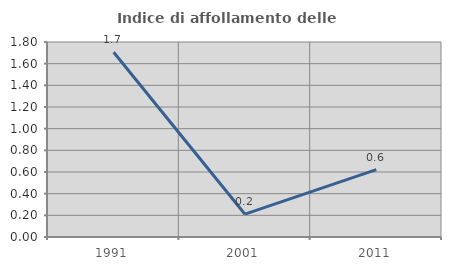
| Category | Indice di affollamento delle abitazioni  |
|---|---|
| 1991.0 | 1.706 |
| 2001.0 | 0.211 |
| 2011.0 | 0.622 |